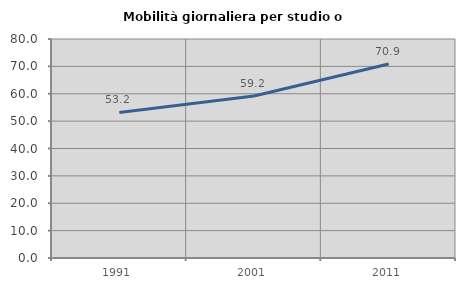
| Category | Mobilità giornaliera per studio o lavoro |
|---|---|
| 1991.0 | 53.191 |
| 2001.0 | 59.203 |
| 2011.0 | 70.872 |